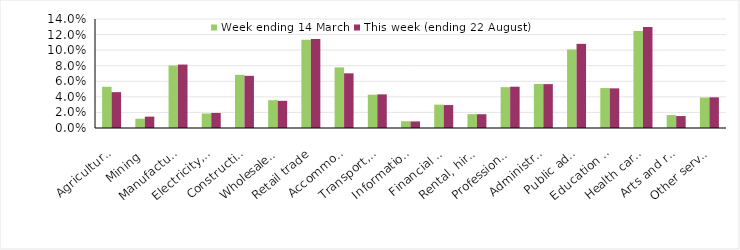
| Category | Week ending 14 March | This week (ending 22 August) |
|---|---|---|
| Agriculture, forestry and fishing | 0.053 | 0.046 |
| Mining | 0.012 | 0.015 |
| Manufacturing | 0.08 | 0.081 |
| Electricity, gas, water and waste services | 0.019 | 0.019 |
| Construction | 0.068 | 0.067 |
| Wholesale trade | 0.036 | 0.035 |
| Retail trade | 0.113 | 0.114 |
| Accommodation and food services | 0.078 | 0.07 |
| Transport, postal and warehousing | 0.043 | 0.043 |
| Information media and telecommunications | 0.009 | 0.008 |
| Financial and insurance services | 0.03 | 0.029 |
| Rental, hiring and real estate services | 0.018 | 0.018 |
| Professional, scientific and technical services | 0.052 | 0.053 |
| Administrative and support services | 0.057 | 0.056 |
| Public administration and safety | 0.101 | 0.108 |
| Education and training | 0.051 | 0.051 |
| Health care and social assistance | 0.125 | 0.13 |
| Arts and recreation services | 0.017 | 0.015 |
| Other services | 0.039 | 0.039 |